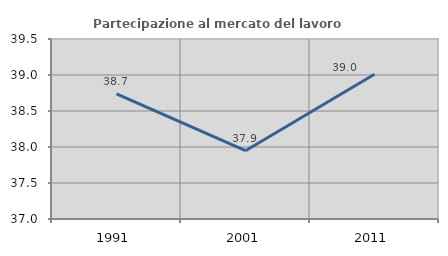
| Category | Partecipazione al mercato del lavoro  femminile |
|---|---|
| 1991.0 | 38.739 |
| 2001.0 | 37.949 |
| 2011.0 | 39.011 |